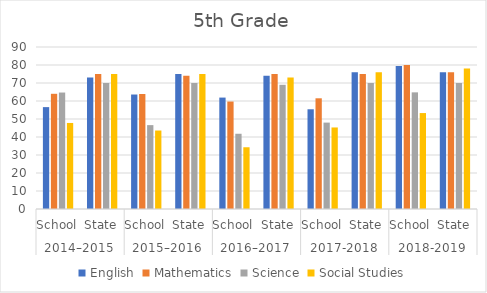
| Category | English | Mathematics | Science | Social Studies |
|---|---|---|---|---|
| 0 | 56.6 | 64 | 64.7 | 47.8 |
| 1 | 73 | 75 | 70 | 75 |
| 2 | 63.6 | 63.9 | 46.6 | 43.6 |
| 3 | 75 | 74 | 70 | 75 |
| 4 | 61.9 | 59.7 | 41.8 | 34.3 |
| 5 | 74 | 75 | 69 | 73 |
| 6 | 55.4 | 61.5 | 48 | 45.3 |
| 7 | 76 | 75 | 70 | 76 |
| 8 | 79.5 | 80 | 64.8 | 53.3 |
| 9 | 76 | 76 | 70 | 78 |